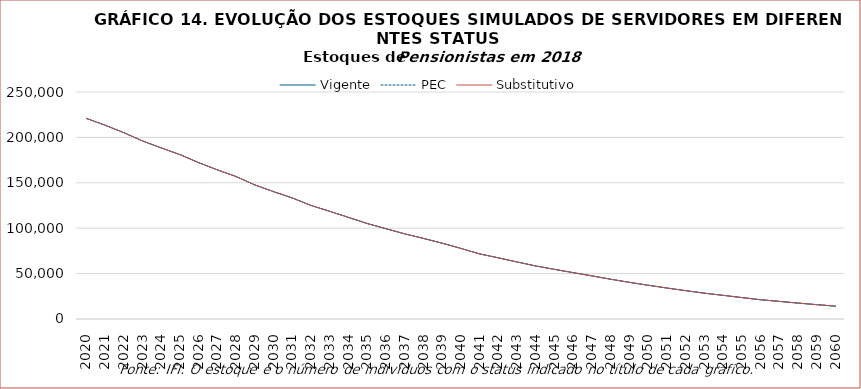
| Category | Vigente | PEC | Substitutivo |
|---|---|---|---|
| 2020.0 | 220917 | 220917 | 220917 |
| 2021.0 | 213418 | 213418 | 213418 |
| 2022.0 | 205225 | 205225 | 205225 |
| 2023.0 | 196065 | 196065 | 196065 |
| 2024.0 | 188380 | 188380 | 188380 |
| 2025.0 | 181010 | 181010 | 181010 |
| 2026.0 | 172149 | 172149 | 172149 |
| 2027.0 | 164200 | 164200 | 164200 |
| 2028.0 | 156855 | 156855 | 156855 |
| 2029.0 | 147604 | 147604 | 147604 |
| 2030.0 | 140208 | 140208 | 140208 |
| 2031.0 | 133248 | 133248 | 133248 |
| 2032.0 | 125008 | 125008 | 125008 |
| 2033.0 | 118536 | 118536 | 118536 |
| 2034.0 | 111846 | 111846 | 111846 |
| 2035.0 | 105134 | 105134 | 105134 |
| 2036.0 | 99383 | 99383 | 99383 |
| 2037.0 | 93713 | 93713 | 93713 |
| 2038.0 | 88713 | 88713 | 88713 |
| 2039.0 | 83463 | 83463 | 83463 |
| 2040.0 | 77705 | 77705 | 77705 |
| 2041.0 | 71672 | 71672 | 71672 |
| 2042.0 | 67331 | 67331 | 67331 |
| 2043.0 | 62785 | 62785 | 62785 |
| 2044.0 | 58358 | 58358 | 58358 |
| 2045.0 | 54637 | 54637 | 54637 |
| 2046.0 | 50992 | 50992 | 50992 |
| 2047.0 | 47447 | 47447 | 47447 |
| 2048.0 | 43763 | 43763 | 43763 |
| 2049.0 | 40333 | 40333 | 40333 |
| 2050.0 | 37157 | 37157 | 37157 |
| 2051.0 | 34097 | 34097 | 34097 |
| 2052.0 | 31192 | 31192 | 31192 |
| 2053.0 | 28423 | 28423 | 28423 |
| 2054.0 | 26037 | 26037 | 26037 |
| 2055.0 | 23579 | 23579 | 23579 |
| 2056.0 | 21195 | 21195 | 21195 |
| 2057.0 | 19387 | 19387 | 19387 |
| 2058.0 | 17502 | 17502 | 17502 |
| 2059.0 | 15810 | 15810 | 15810 |
| 2060.0 | 14131 | 14131 | 14131 |